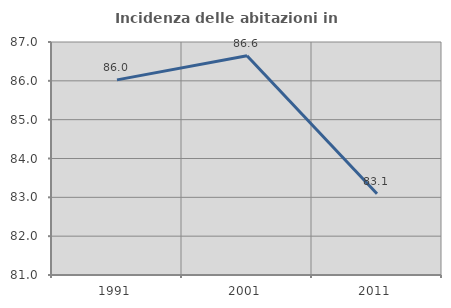
| Category | Incidenza delle abitazioni in proprietà  |
|---|---|
| 1991.0 | 86.025 |
| 2001.0 | 86.644 |
| 2011.0 | 83.094 |